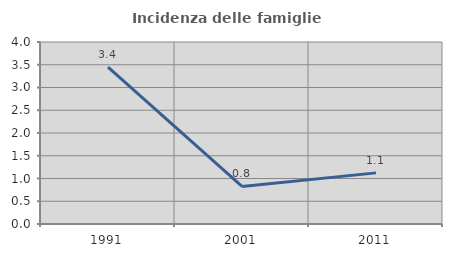
| Category | Incidenza delle famiglie numerose |
|---|---|
| 1991.0 | 3.448 |
| 2001.0 | 0.826 |
| 2011.0 | 1.124 |